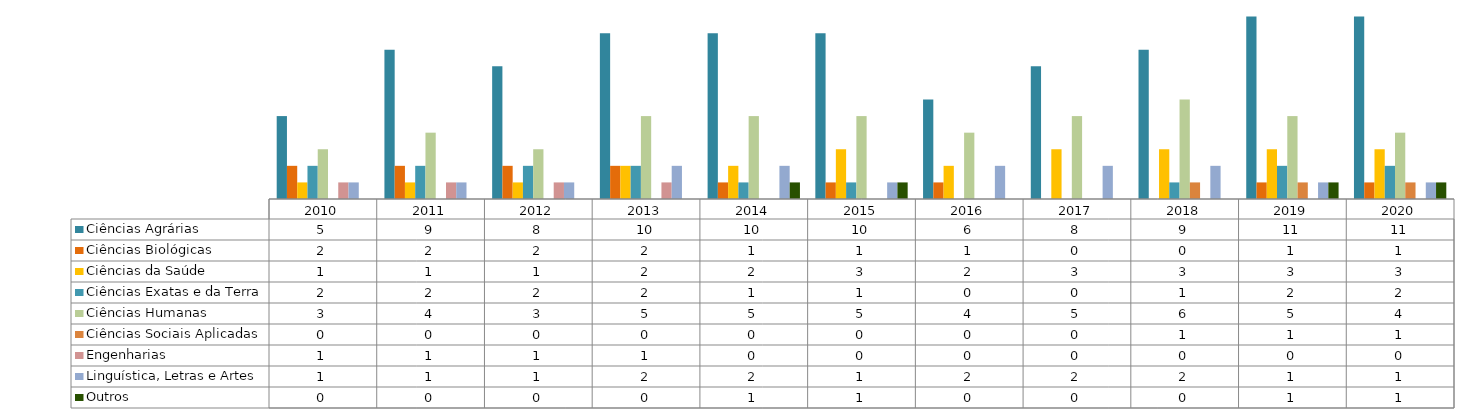
| Category | Ciências Agrárias  | Ciências Biológicas  | Ciências da Saúde  | Ciências Exatas e da Terra  | Ciências Humanas  | Ciências Sociais Aplicadas  | Engenharias  | Linguística, Letras e Artes  | Outros |
|---|---|---|---|---|---|---|---|---|---|
| 2010.0 | 5 | 2 | 1 | 2 | 3 | 0 | 1 | 1 | 0 |
| 2011.0 | 9 | 2 | 1 | 2 | 4 | 0 | 1 | 1 | 0 |
| 2012.0 | 8 | 2 | 1 | 2 | 3 | 0 | 1 | 1 | 0 |
| 2013.0 | 10 | 2 | 2 | 2 | 5 | 0 | 1 | 2 | 0 |
| 2014.0 | 10 | 1 | 2 | 1 | 5 | 0 | 0 | 2 | 1 |
| 2015.0 | 10 | 1 | 3 | 1 | 5 | 0 | 0 | 1 | 1 |
| 2016.0 | 6 | 1 | 2 | 0 | 4 | 0 | 0 | 2 | 0 |
| 2017.0 | 8 | 0 | 3 | 0 | 5 | 0 | 0 | 2 | 0 |
| 2018.0 | 9 | 0 | 3 | 1 | 6 | 1 | 0 | 2 | 0 |
| 2019.0 | 11 | 1 | 3 | 2 | 5 | 1 | 0 | 1 | 1 |
| 2020.0 | 11 | 1 | 3 | 2 | 4 | 1 | 0 | 1 | 1 |